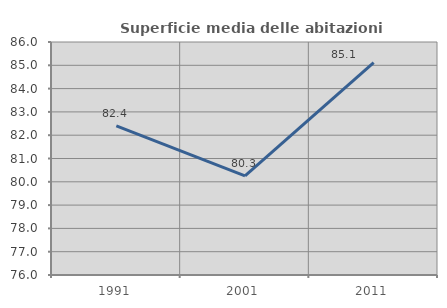
| Category | Superficie media delle abitazioni occupate |
|---|---|
| 1991.0 | 82.399 |
| 2001.0 | 80.252 |
| 2011.0 | 85.111 |